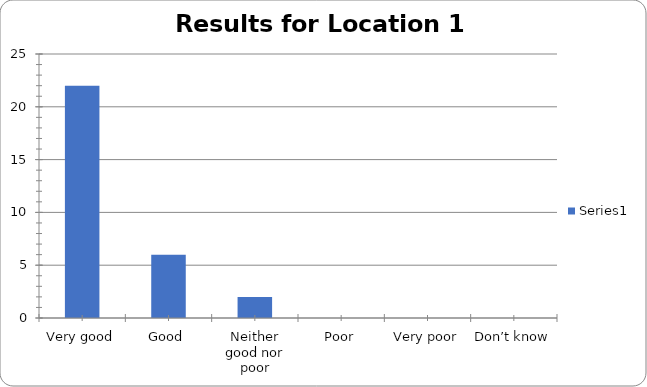
| Category | Series 0 |
|---|---|
| Very good | 22 |
| Good | 6 |
| Neither good nor poor | 2 |
| Poor | 0 |
| Very poor | 0 |
| Don’t know | 0 |